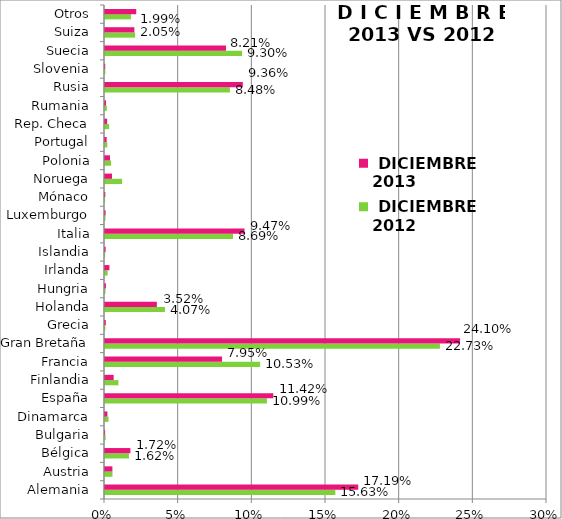
| Category |  DICIEMBRE 2012 |  DICIEMBRE 2013 |
|---|---|---|
| Alemania | 0.156 | 0.172 |
| Austria | 0.005 | 0.005 |
| Bélgica | 0.016 | 0.017 |
| Bulgaria | 0 | 0 |
| Dinamarca | 0.002 | 0.002 |
| España | 0.11 | 0.114 |
| Finlandia | 0.009 | 0.006 |
| Francia | 0.105 | 0.079 |
| Gran Bretaña | 0.227 | 0.241 |
| Grecia | 0 | 0.001 |
| Holanda | 0.041 | 0.035 |
| Hungria | 0 | 0.001 |
| Irlanda | 0.002 | 0.003 |
| Islandia | 0 | 0 |
| Italia | 0.087 | 0.095 |
| Luxemburgo | 0 | 0 |
| Mónaco | 0 | 0 |
| Noruega | 0.012 | 0.005 |
| Polonia | 0.004 | 0.003 |
| Portugal | 0.002 | 0.001 |
| Rep. Checa | 0.003 | 0.001 |
| Rumania | 0.001 | 0.001 |
| Rusia | 0.085 | 0.094 |
| Slovenia | 0 | 0 |
| Suecia | 0.093 | 0.082 |
| Suiza | 0.02 | 0.02 |
| Otros | 0.018 | 0.021 |